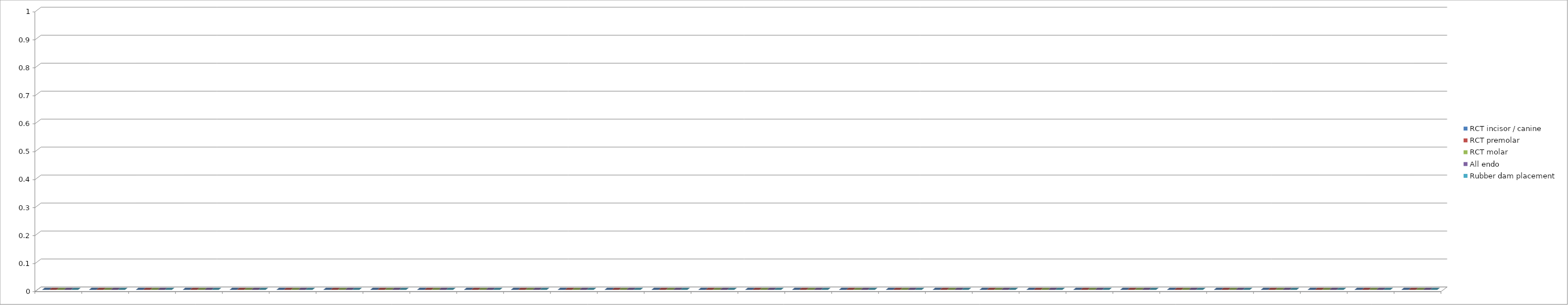
| Category | RCT incisor / canine | RCT premolar | RCT molar | All endo | Rubber dam placement |
|---|---|---|---|---|---|
| 0 | 0 | 0 | 0 | 0 | 0 |
| 1 | 0 | 0 | 0 | 0 | 0 |
| 2 | 0 | 0 | 0 | 0 | 0 |
| 3 | 0 | 0 | 0 | 0 | 0 |
| 4 | 0 | 0 | 0 | 0 | 0 |
| 5 | 0 | 0 | 0 | 0 | 0 |
| 6 | 0 | 0 | 0 | 0 | 0 |
| 7 | 0 | 0 | 0 | 0 | 0 |
| 8 | 0 | 0 | 0 | 0 | 0 |
| 9 | 0 | 0 | 0 | 0 | 0 |
| 10 | 0 | 0 | 0 | 0 | 0 |
| 11 | 0 | 0 | 0 | 0 | 0 |
| 12 | 0 | 0 | 0 | 0 | 0 |
| 13 | 0 | 0 | 0 | 0 | 0 |
| 14 | 0 | 0 | 0 | 0 | 0 |
| 15 | 0 | 0 | 0 | 0 | 0 |
| 16 | 0 | 0 | 0 | 0 | 0 |
| 17 | 0 | 0 | 0 | 0 | 0 |
| 18 | 0 | 0 | 0 | 0 | 0 |
| 19 | 0 | 0 | 0 | 0 | 0 |
| 20 | 0 | 0 | 0 | 0 | 0 |
| 21 | 0 | 0 | 0 | 0 | 0 |
| 22 | 0 | 0 | 0 | 0 | 0 |
| 23 | 0 | 0 | 0 | 0 | 0 |
| 24 | 0 | 0 | 0 | 0 | 0 |
| 25 | 0 | 0 | 0 | 0 | 0 |
| 26 | 0 | 0 | 0 | 0 | 0 |
| 27 | 0 | 0 | 0 | 0 | 0 |
| 28 | 0 | 0 | 0 | 0 | 0 |
| 29 | 0 | 0 | 0 | 0 | 0 |